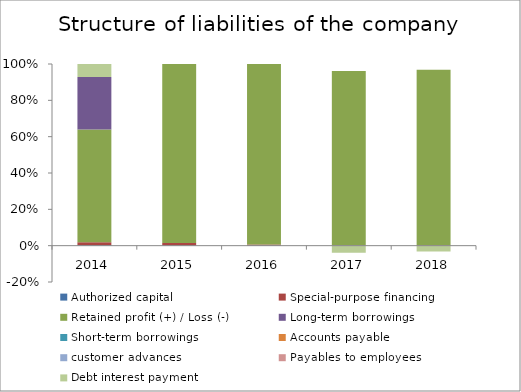
| Category | Authorized capital | Special-purpose financing | Retained profit (+) / Loss (-) | Long-term borrowings | Short-term borrowings | Accounts payable | customer advances | Payables to employees | Debt interest payment |
|---|---|---|---|---|---|---|---|---|---|
| 2014.0 | 0.003 | 0.017 | 0.62 | 0.289 | 0 | 0 | 0 | 0 | 0.072 |
| 2015.0 | 0.001 | 0.014 | 0.985 | 0 | 0 | 0 | 0 | 0 | 0 |
| 2016.0 | 0.001 | 0.006 | 0.994 | 0 | 0 | 0 | 0 | 0 | 0 |
| 2017.0 | 0 | 0.003 | 1.039 | 0 | 0 | 0 | 0 | 0 | -0.042 |
| 2018.0 | 0 | 0.002 | 1.032 | 0 | 0 | 0 | 0 | 0 | -0.034 |